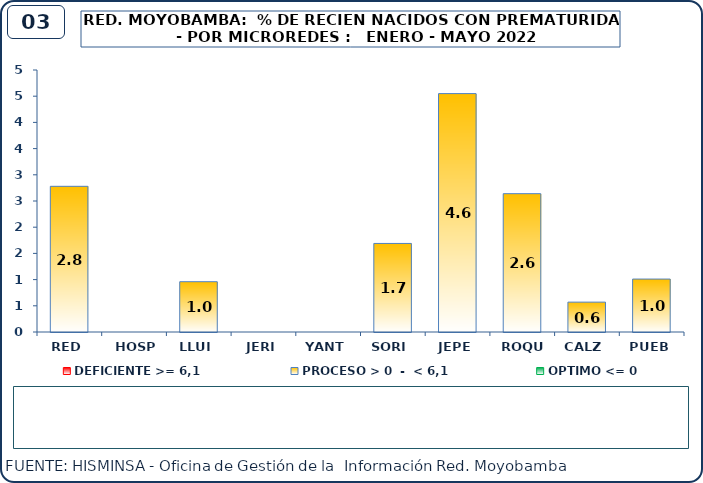
| Category | DEFICIENTE >= 6,1 | PROCESO > 0  -  < 6,1 | OPTIMO <= 0 |
|---|---|---|---|
| RED | 0 | 2.78 | 0 |
| HOSP | 0 | 0 | 0 |
| LLUI | 0 | 0.96 | 0 |
| JERI | 0 | 0 | 0 |
| YANT | 0 | 0 | 0 |
| SORI | 0 | 1.69 | 0 |
| JEPE | 0 | 4.55 | 0 |
| ROQU | 0 | 2.64 | 0 |
| CALZ | 0 | 0.57 | 0 |
| PUEB | 0 | 1.01 | 0 |